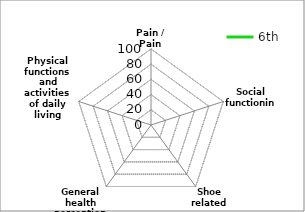
| Category | 6th |
|---|---|
| Pain / Pain related | 0 |
| Social functioning | 0 |
| Shoe related | 0 |
| General health perceptions | 0 |
| Physical functions and activities of daily living (ADL) | 0 |